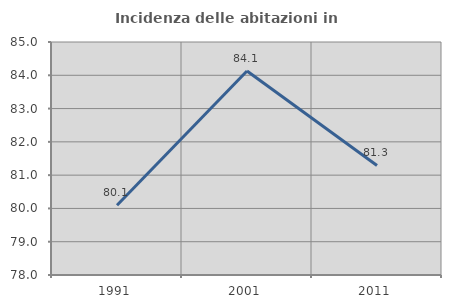
| Category | Incidenza delle abitazioni in proprietà  |
|---|---|
| 1991.0 | 80.097 |
| 2001.0 | 84.127 |
| 2011.0 | 81.29 |